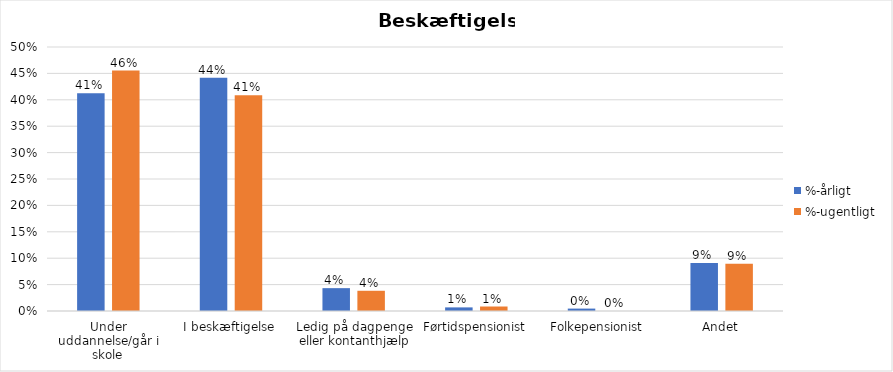
| Category | %-årligt | %-ugentligt |
|---|---|---|
| Under uddannelse/går i skole | 0.412 | 0.455 |
| I beskæftigelse | 0.442 | 0.409 |
| Ledig på dagpenge eller kontanthjælp | 0.043 | 0.038 |
| Førtidspensionist | 0.007 | 0.009 |
| Folkepensionist | 0.005 | 0 |
| Andet | 0.091 | 0.089 |